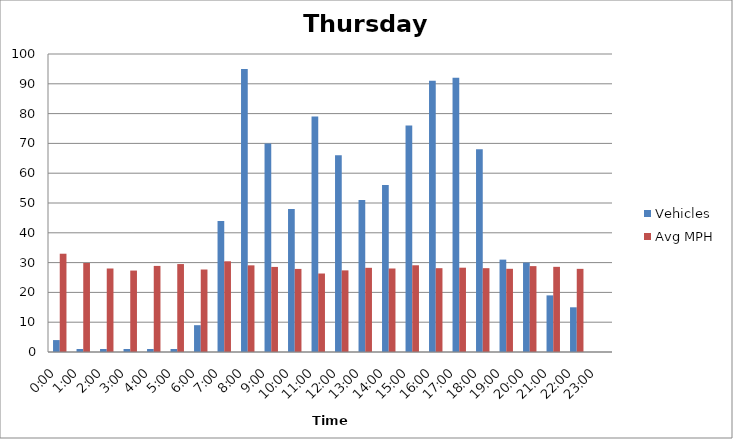
| Category | Vehicles | Avg MPH |
|---|---|---|
| 0:00 | 4 | 32.98 |
| 1:00 | 1 | 29.87 |
| 2:00 | 1 | 28.02 |
| 3:00 | 1 | 27.33 |
| 4:00 | 1 | 28.89 |
| 5:00 | 1 | 29.51 |
| 6:00 | 9 | 27.68 |
| 7:00 | 44 | 30.44 |
| 8:00 | 95 | 29.08 |
| 9:00 | 70 | 28.55 |
| 10:00 | 48 | 27.88 |
| 11:00 | 79 | 26.34 |
| 12:00 | 66 | 27.39 |
| 13:00 | 51 | 28.25 |
| 14:00 | 56 | 28.02 |
| 15:00 | 76 | 29.1 |
| 16:00 | 91 | 28.13 |
| 17:00 | 92 | 28.29 |
| 18:00 | 68 | 28.13 |
| 19:00 | 31 | 27.92 |
| 20:00 | 30 | 28.82 |
| 21:00 | 19 | 28.58 |
| 22:00 | 15 | 27.9 |
| 23:00 | 0 | 0 |